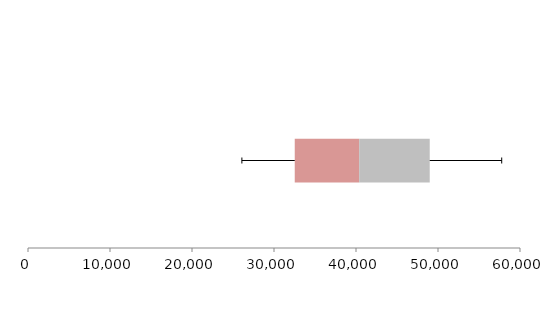
| Category | Series 1 | Series 2 | Series 3 |
|---|---|---|---|
| 0 | 32529.864 | 7859.554 | 8603.47 |